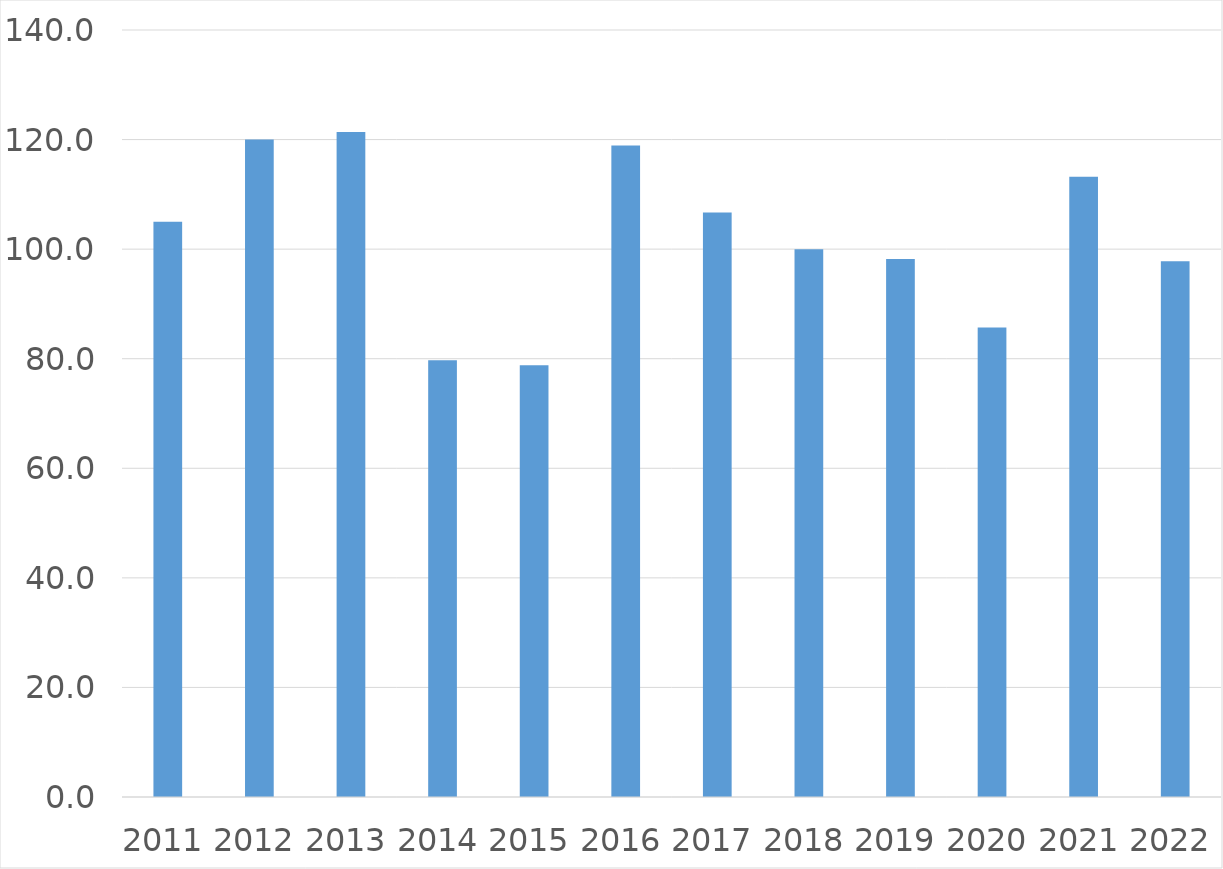
| Category | Series 0 |
|---|---|
| 2011 | 105 |
| 2012 | 120 |
| 2013 | 121.4 |
| 2014 | 79.7 |
| 2015 | 78.8 |
| 2016 | 118.9 |
| 2017 | 106.7 |
| 2018 | 100 |
| 2019 | 98.2 |
| 2020 | 85.7 |
| 2021 | 113.2 |
| 2022 | 97.8 |